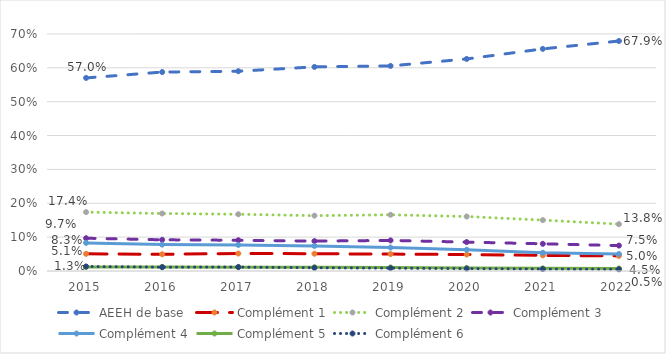
| Category | AEEH de base | Complément 1 | Complément 2 | Complément 3 | Complément 4 | Complément 5 | Complément 6 |
|---|---|---|---|---|---|---|---|
| 2015.0 | 0.57 | 0.051 | 0.174 | 0.097 | 0.083 | 0.012 | 0.013 |
| 2016.0 | 0.587 | 0.049 | 0.17 | 0.092 | 0.078 | 0.012 | 0.011 |
| 2017.0 | 0.59 | 0.052 | 0.168 | 0.091 | 0.077 | 0.011 | 0.012 |
| 2018.0 | 0.603 | 0.051 | 0.163 | 0.088 | 0.074 | 0.011 | 0.009 |
| 2019.0 | 0.606 | 0.05 | 0.166 | 0.09 | 0.069 | 0.011 | 0.008 |
| 2020.0 | 0.626 | 0.049 | 0.161 | 0.085 | 0.063 | 0.009 | 0.007 |
| 2021.0 | 0.656 | 0.046 | 0.15 | 0.08 | 0.054 | 0.008 | 0.006 |
| 2022.0 | 0.679 | 0.045 | 0.138 | 0.075 | 0.05 | 0.008 | 0.005 |